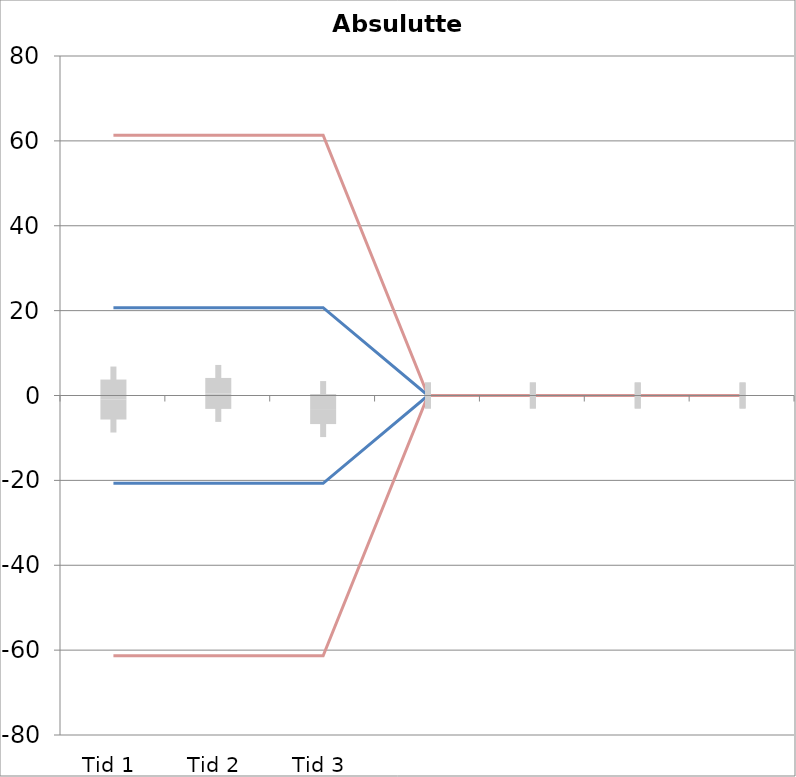
| Category | 1 | 2 | 3 | 4 | 5 | 6 | 7 | 8 | 9 | 10 | 11 | 12 | 13 | 14 | 15 | 16 | 17 | 18 | 19 | 20 | TEa | B | -B | -TEa | M |
|---|---|---|---|---|---|---|---|---|---|---|---|---|---|---|---|---|---|---|---|---|---|---|---|---|---|
| Tid 1 | -3.6 | 19.6 | 2 | -0.4 | 3.2 | -6.5 | 1.3 | -5 | -9.8 | -9.9 | 2.4 | 7.9 | 12 | -13.7 | -15.7 | 9.6 | 0.8 | 0 | -11.3 | 0 | 61.332 | 20.69 | -20.69 | -61.332 | -0.95 |
| Tid 2 | 0.1 | 3.2 | 8.5 | 1.1 | 4.4 | 1 | 7.4 | 1.2 | -2.1 | -9 | 7.2 | -1.7 | 15.4 | -9 | -15.6 | 12.1 | 2.2 | -10.2 | -0.1 | -6.3 | 61.332 | 20.69 | -20.69 | -61.332 | 0.49 |
| Tid 3 | 2.1 | 8.2 | -3.5 | -4.9 | -1.6 | -6 | -5.6 | 7.2 | -7.1 | 0 | 0 | 0 | 0 | 0 | 0 | -14 | 0.6 | -4.4 | -10.1 | -5.7 | 61.332 | 20.69 | -20.69 | -61.332 | -3.2 |